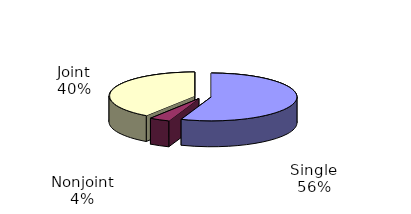
| Category | Series 0 |
|---|---|
| Single | 1999520 |
| Separate | 138106 |
| Joint | 1451051 |